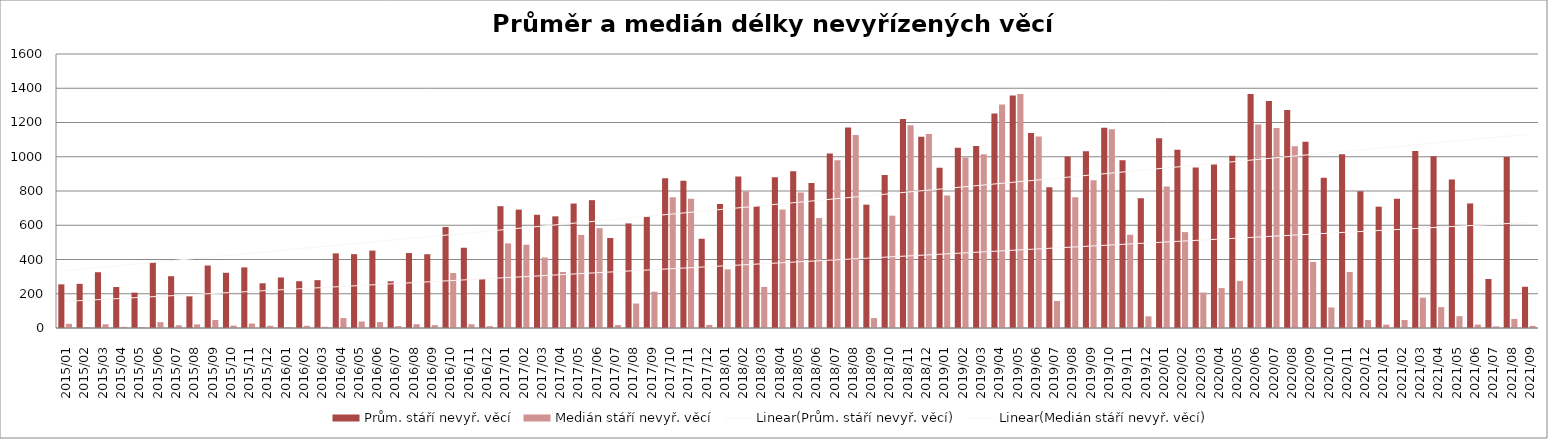
| Category | Prům. stáří nevyř. věcí | Medián stáří nevyř. věcí |
|---|---|---|
| 2015/01 | 254.8 | 24.5 |
| 2015/02 | 257.83 | 4 |
| 2015/03 | 325.71 | 22 |
| 2015/04 | 239.18 | 7 |
| 2015/05 | 206.38 | 5 |
| 2015/06 | 385.46 | 34 |
| 2015/07 | 302.35 | 15.5 |
| 2015/08 | 184.85 | 21 |
| 2015/09 | 364.92 | 47 |
| 2015/10 | 322.48 | 14.5 |
| 2015/11 | 353.85 | 26 |
| 2015/12 | 261.16 | 13 |
| 2016/01 | 295.12 | 5 |
| 2016/02 | 273.2 | 13 |
| 2016/03 | 279.43 | 7 |
| 2016/04 | 435.66 | 58 |
| 2016/05 | 431.15 | 38 |
| 2016/06 | 451.99 | 34.5 |
| 2016/07 | 272.47 | 11 |
| 2016/08 | 437.53 | 22 |
| 2016/09 | 430.75 | 17 |
| 2016/10 | 589.53 | 321 |
| 2016/11 | 468.58 | 22 |
| 2016/12 | 285.43 | 11 |
| 2017/01 | 711.29 | 494 |
| 2017/02 | 691.31 | 486.5 |
| 2017/03 | 661.13 | 411.5 |
| 2017/04 | 652.01 | 327 |
| 2017/05 | 726.71 | 543.5 |
| 2017/06 | 746.57 | 583 |
| 2017/07 | 525.73 | 17 |
| 2017/08 | 610.86 | 143 |
| 2017/09 | 650.38 | 212 |
| 2017/10 | 874.27 | 763 |
| 2017/11 | 860.01 | 755 |
| 2017/12 | 521.29 | 18 |
| 2018/01 | 724.21 | 342.5 |
| 2018/02 | 884.03 | 798 |
| 2018/03 | 712.16 | 240 |
| 2018/04 | 880.16 | 692 |
| 2018/05 | 914.68 | 791 |
| 2018/06 | 846.95 | 642 |
| 2018/07 | 1018.29 | 979 |
| 2018/08 | 1170.66 | 1127 |
| 2018/09 | 720.13 | 58 |
| 2018/10 | 893.51 | 656 |
| 2018/11 | 1220.09 | 1184 |
| 2018/12 | 1117.11 | 1132.5 |
| 2019/01 | 935.18 | 773 |
| 2019/02 | 1052 | 996 |
| 2019/03 | 1062.47 | 1015 |
| 2019/04 | 1252.9 | 1305 |
| 2019/05 | 1358.27 | 1367 |
| 2019/06 | 1139.23 | 1118 |
| 2019/07 | 821.52 | 158 |
| 2019/08 | 1000.88 | 764 |
| 2019/09 | 1032.48 | 863 |
| 2019/10 | 1169.87 | 1161 |
| 2019/11 | 978.98 | 544.5 |
| 2019/12 | 757.9 | 68 |
| 2020/01 | 1107.64 | 827 |
| 2020/02 | 1040.85 | 560 |
| 2020/03 | 936.91 | 207 |
| 2020/04 | 954.34 | 233 |
| 2020/05 | 1005.88 | 275 |
| 2020/06 | 1366.02 | 1188 |
| 2020/07 | 1325.34 | 1168 |
| 2020/08 | 1272.49 | 1062 |
| 2020/09 | 1087.03 | 386 |
| 2020/10 | 877.38 | 120 |
| 2020/11 | 1014.92 | 327 |
| 2020/12 | 799.18 | 47 |
| 2021/01 | 708.42 | 20 |
| 2021/02 | 755.47 | 47 |
| 2021/03 | 1033.91 | 177 |
| 2021/04 | 1002.21 | 122 |
| 2021/05 | 866.76 | 69 |
| 2021/06 | 727.41 | 20 |
| 2021/07 | 286.08 | 9.5 |
| 2021/08 | 997.94 | 53 |
| 2021/09 | 240.78 | 12 |